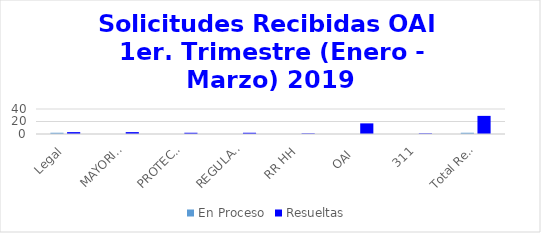
| Category | En Proceso | Resueltas  |
|---|---|---|
| Legal | 2 | 3 |
| MAYORISTA | 0 | 3 |
| PROTECOM | 0 | 2 |
| REGULACIÓN | 0 | 2 |
| RR HH | 0 | 1 |
| OAI  | 0 | 17 |
| 311 | 0 | 1 |
| Total Recibidas | 2 | 29 |